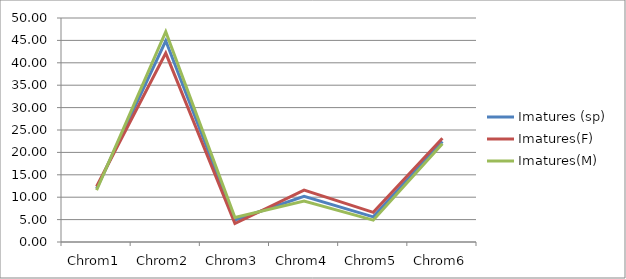
| Category | Imatures (sp) | Imatures(F)  | Imatures(M) |
|---|---|---|---|
| Chrom1 | 11.93 | 12.397 | 11.585 |
| Chrom2 | 44.912 | 42.149 | 46.951 |
| Chrom3 | 4.912 | 4.132 | 5.488 |
| Chrom4 | 10.175 | 11.57 | 9.146 |
| Chrom5 | 5.614 | 6.612 | 4.878 |
| Chrom6 | 22.456 | 23.14 | 21.951 |